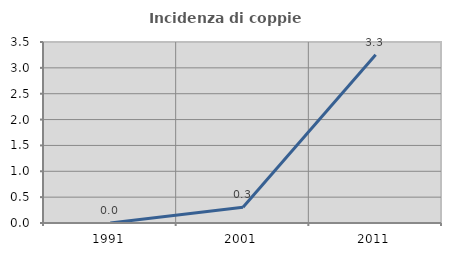
| Category | Incidenza di coppie miste |
|---|---|
| 1991.0 | 0 |
| 2001.0 | 0.305 |
| 2011.0 | 3.253 |